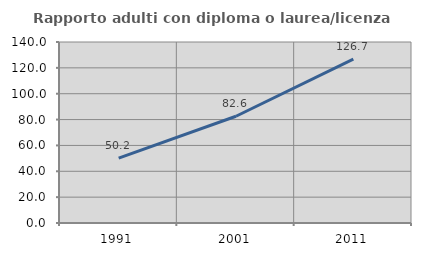
| Category | Rapporto adulti con diploma o laurea/licenza media  |
|---|---|
| 1991.0 | 50.201 |
| 2001.0 | 82.569 |
| 2011.0 | 126.73 |